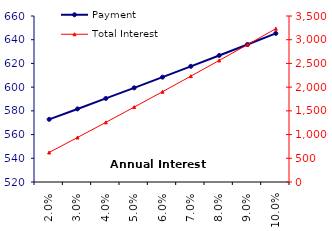
| Category | Payment |
|---|---|
| 0.02 | 572.85 |
| 0.03 | 581.62 |
| 0.04 | 590.48 |
| 0.05 | 599.42 |
| 0.06 | 608.44 |
| 0.07 | 617.54 |
| 0.08 | 626.73 |
| 0.09 | 635.99 |
| 0.1 | 645.34 |